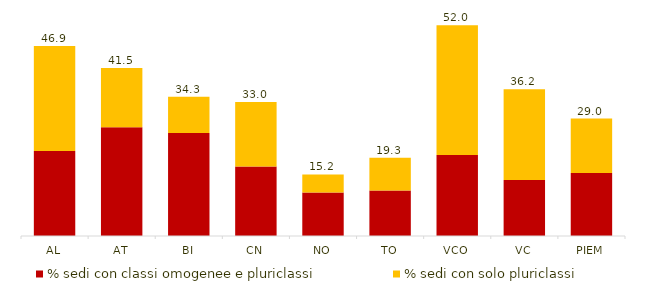
| Category | % sedi con classi omogenee e pluriclassi | % sedi con solo pluriclassi | Totale sedi con pluriclassi |
|---|---|---|---|
| AL | 20.979 | 25.874 | 46.853 |
| AT | 26.829 | 14.634 | 41.463 |
| BI | 25.373 | 8.955 | 34.328 |
| CN | 17.167 | 15.88 | 33.047 |
| NO | 10.714 | 4.464 | 15.179 |
| TO | 11.228 | 8.07 | 19.298 |
| VCO | 20 | 32 | 52 |
| VC | 13.793 | 22.414 | 36.207 |
| PIEM | 15.522 | 13.433 | 28.955 |